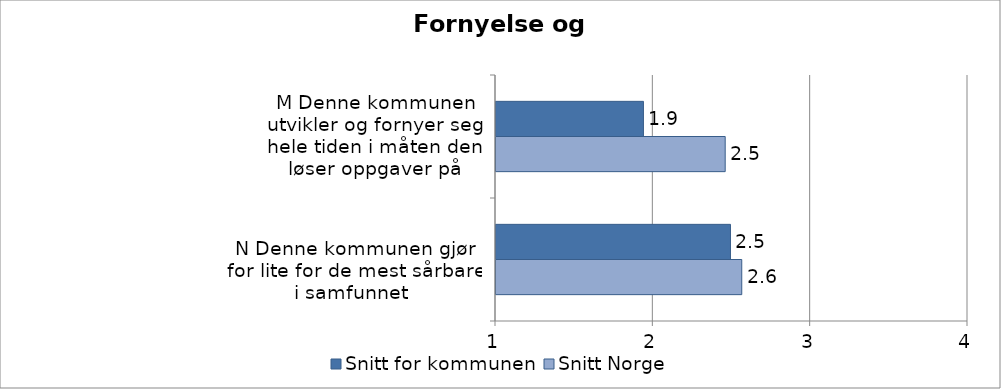
| Category | Snitt for kommunen | Snitt Norge |
|---|---|---|
| M Denne kommunen utvikler og fornyer seg hele tiden i måten den løser oppgaver på | 1.937 | 2.457 |
| 
N Denne kommunen gjør for lite for de mest sårbare i samfunnet  | 2.49 | 2.562 |